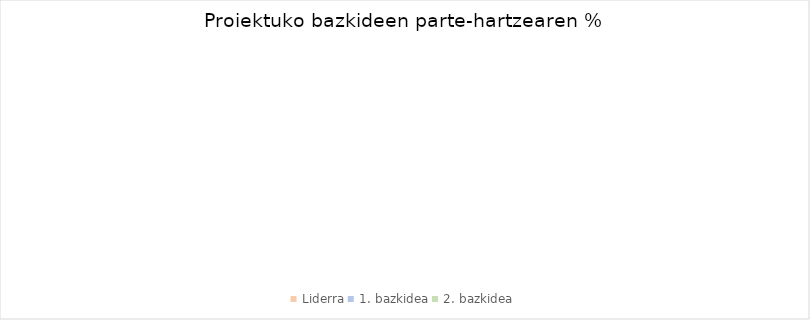
| Category | Series 0 |
|---|---|
| Liderra | 0 |
| 1. bazkidea | 0 |
| 2. bazkidea | 0 |